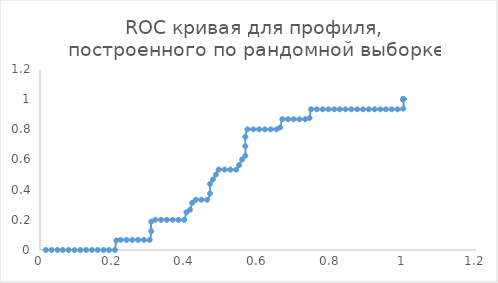
| Category | Series 0 |
|---|---|
| 0.016 | 0 |
| 0.032 | 0 |
| 0.048 | 0 |
| 0.0629999999999999 | 0 |
| 0.079 | 0 |
| 0.0949999999999999 | 0 |
| 0.111 | 0 |
| 0.127 | 0 |
| 0.143 | 0 |
| 0.159 | 0 |
| 0.175 | 0 |
| 0.19 | 0 |
| 0.206 | 0 |
| 0.21 | 0.063 |
| 0.222 | 0.067 |
| 0.238 | 0.067 |
| 0.254 | 0.067 |
| 0.27 | 0.067 |
| 0.286 | 0.067 |
| 0.302 | 0.067 |
| 0.306 | 0.125 |
| 0.306 | 0.188 |
| 0.317 | 0.2 |
| 0.333 | 0.2 |
| 0.349 | 0.2 |
| 0.365 | 0.2 |
| 0.381 | 0.2 |
| 0.397 | 0.2 |
| 0.403 | 0.25 |
| 0.413 | 0.267 |
| 0.419 | 0.313 |
| 0.429 | 0.333 |
| 0.444 | 0.333 |
| 0.46 | 0.333 |
| 0.468 | 0.375 |
| 0.468 | 0.438 |
| 0.476 | 0.467 |
| 0.484 | 0.5 |
| 0.492 | 0.533 |
| 0.508 | 0.533 |
| 0.524 | 0.533 |
| 0.54 | 0.533 |
| 0.548 | 0.563 |
| 0.556 | 0.6 |
| 0.565 | 0.625 |
| 0.565 | 0.688 |
| 0.565 | 0.75 |
| 0.571 | 0.8 |
| 0.587 | 0.8 |
| 0.603 | 0.8 |
| 0.619 | 0.8 |
| 0.635 | 0.8 |
| 0.651 | 0.8 |
| 0.661 | 0.813 |
| 0.667 | 0.867 |
| 0.683 | 0.867 |
| 0.698 | 0.867 |
| 0.714 | 0.867 |
| 0.73 | 0.867 |
| 0.742 | 0.875 |
| 0.746 | 0.933 |
| 0.762 | 0.933 |
| 0.778 | 0.933 |
| 0.794 | 0.933 |
| 0.81 | 0.933 |
| 0.825 | 0.933 |
| 0.841 | 0.933 |
| 0.857 | 0.933 |
| 0.873 | 0.933 |
| 0.889 | 0.933 |
| 0.905 | 0.933 |
| 0.921 | 0.933 |
| 0.937 | 0.933 |
| 0.952 | 0.933 |
| 0.968 | 0.933 |
| 0.984 | 0.933 |
| 1.0 | 0.938 |
| 1.0 | 1 |
| 1.0 | 1 |
| 1.0 | 1 |
| 1.0 | 1 |
| 1.0 | 1 |
| 1.0 | 1 |
| 1.0 | 1 |
| 1.0 | 1 |
| 1.0 | 1 |
| 1.0 | 1 |
| 1.0 | 1 |
| 1.0 | 1 |
| 1.0 | 1 |
| 1.0 | 1 |
| 1.0 | 1 |
| 1.0 | 1 |
| 1.0 | 1 |
| 1.0 | 1 |
| 1.0 | 1 |
| 1.0 | 1 |
| 1.0 | 1 |
| 1.0 | 1 |